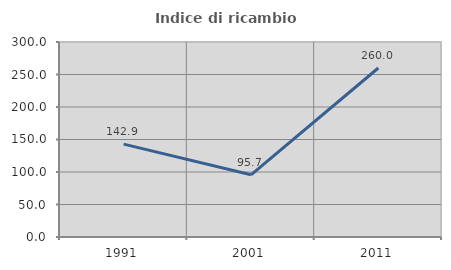
| Category | Indice di ricambio occupazionale  |
|---|---|
| 1991.0 | 142.857 |
| 2001.0 | 95.652 |
| 2011.0 | 260 |